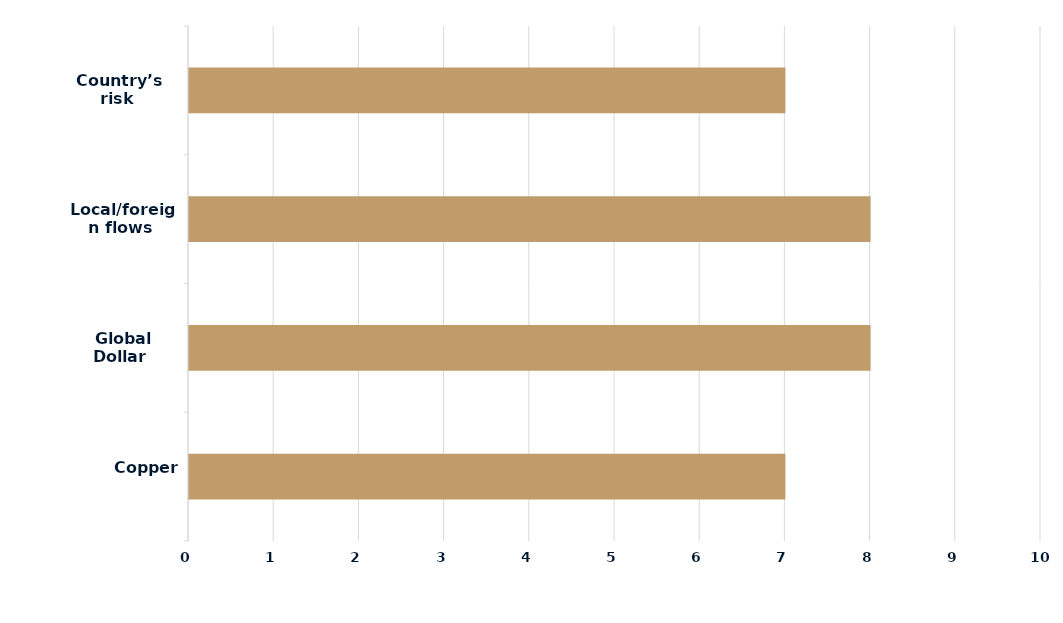
| Category | Series 0 |
|---|---|
|  Copper | 7 |
|  Global Dollar | 8 |
|  Local/foreign flows | 8 |
|  Country’s risk | 7 |